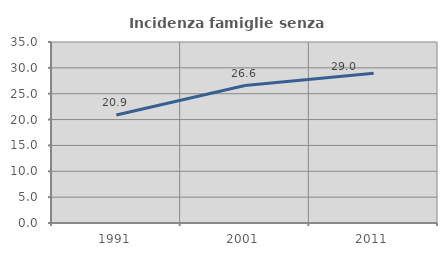
| Category | Incidenza famiglie senza nuclei |
|---|---|
| 1991.0 | 20.877 |
| 2001.0 | 26.586 |
| 2011.0 | 28.969 |